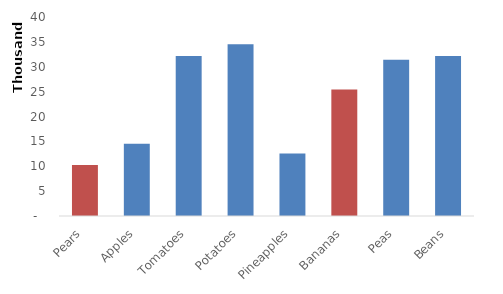
| Category | Series 0 | Series 1 |
|---|---|---|
| Pears | 0 | 10245 |
| Apples | 14523 | 0 |
| Tomatoes | 32154 | 0 |
| Potatoes | 34512 | 0 |
| Pineapples | 12568 | 0 |
| Bananas | 0 | 25412 |
| Peas | 31425 | 0 |
| Beans | 32145 | 0 |